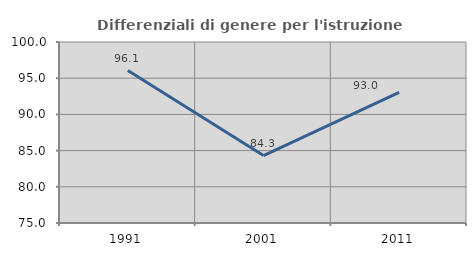
| Category | Differenziali di genere per l'istruzione superiore |
|---|---|
| 1991.0 | 96.059 |
| 2001.0 | 84.314 |
| 2011.0 | 93.032 |